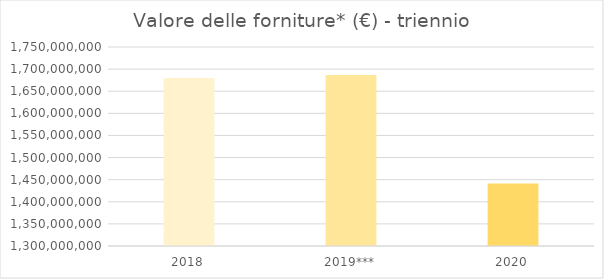
| Category | Series 0 |
|---|---|
| 2018 | 1679942150 |
| 2019*** | 1686695159 |
| 2020 | 1441404805 |